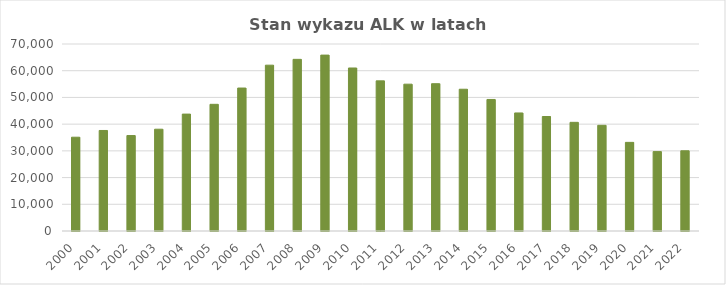
| Category | Series 0 |
|---|---|
| 2000.0 | 35111 |
| 2001.0 | 37632 |
| 2002.0 | 35726 |
| 2003.0 | 38101 |
| 2004.0 | 43756 |
| 2005.0 | 47421 |
| 2006.0 | 53517 |
| 2007.0 | 62074 |
| 2008.0 | 64255 |
| 2009.0 | 65843 |
| 2010.0 | 61020 |
| 2011.0 | 56200 |
| 2012.0 | 54958 |
| 2013.0 | 55143 |
| 2014.0 | 53064 |
| 2015.0 | 49240 |
| 2016.0 | 44193 |
| 2017.0 | 42859 |
| 2018.0 | 40679 |
| 2019.0 | 39560 |
| 2020.0 | 33177 |
| 2021.0 | 29723 |
| 2022.0 | 30032 |